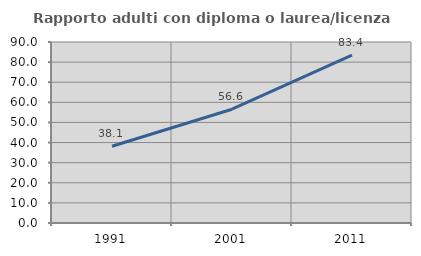
| Category | Rapporto adulti con diploma o laurea/licenza media  |
|---|---|
| 1991.0 | 38.144 |
| 2001.0 | 56.573 |
| 2011.0 | 83.416 |